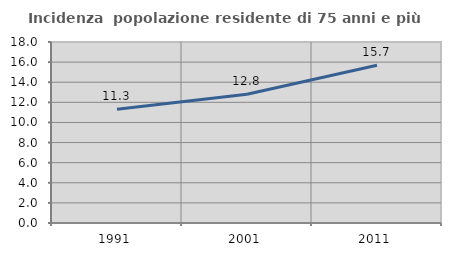
| Category | Incidenza  popolazione residente di 75 anni e più |
|---|---|
| 1991.0 | 11.307 |
| 2001.0 | 12.811 |
| 2011.0 | 15.69 |